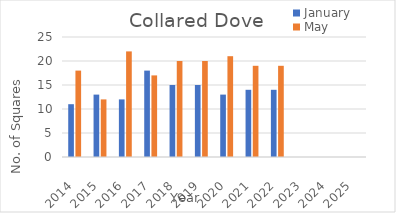
| Category | January | May |
|---|---|---|
| 2014.0 | 11 | 18 |
| 2015.0 | 13 | 12 |
| 2016.0 | 12 | 22 |
| 2017.0 | 18 | 17 |
| 2018.0 | 15 | 20 |
| 2019.0 | 15 | 20 |
| 2020.0 | 13 | 21 |
| 2021.0 | 14 | 19 |
| 2022.0 | 14 | 19 |
| 2023.0 | 0 | 0 |
| 2024.0 | 0 | 0 |
| 2025.0 | 0 | 0 |